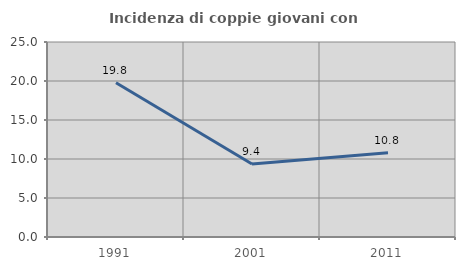
| Category | Incidenza di coppie giovani con figli |
|---|---|
| 1991.0 | 19.767 |
| 2001.0 | 9.363 |
| 2011.0 | 10.811 |